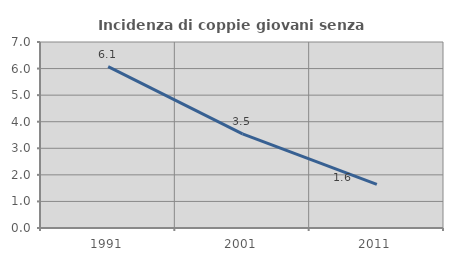
| Category | Incidenza di coppie giovani senza figli |
|---|---|
| 1991.0 | 6.07 |
| 2001.0 | 3.544 |
| 2011.0 | 1.639 |